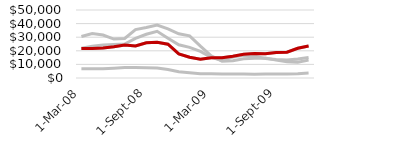
| Category | Chewbacca | Hansolo | James Kirk | Luke Skywalker | Chart Series |
|---|---|---|---|---|---|
| 2008-03-01 | 6800.212 | 21645.733 | 21915.526 | 30565.916 | 21645.733 |
| 2008-04-01 | 6769.22 | 21751.544 | 23276.043 | 32691.851 | 21751.544 |
| 2008-05-01 | 6837.89 | 22045.744 | 24221.882 | 31596.879 | 22045.744 |
| 2008-06-01 | 7235.322 | 22991.915 | 24615.492 | 28625.605 | 22991.915 |
| 2008-07-01 | 7671.87 | 24306.774 | 24910.431 | 29048.404 | 24306.774 |
| 2008-08-01 | 7752.169 | 23598.937 | 29152.21 | 35579.129 | 23598.937 |
| 2008-09-01 | 7557.637 | 25943.949 | 32132.61 | 37086.637 | 25943.949 |
| 2008-10-01 | 7401.609 | 26291.553 | 34356.215 | 38893.36 | 26291.553 |
| 2008-11-01 | 6240.589 | 24834.553 | 29274.208 | 36179.556 | 24834.553 |
| 2008-12-01 | 4608.259 | 17763.187 | 24423.996 | 32497.363 | 17763.187 |
| 2009-01-01 | 3829.339 | 15307.944 | 22487.397 | 30959.569 | 15307.944 |
| 2009-02-01 | 3177.815 | 13800.843 | 19550.976 | 23433.602 | 13800.843 |
| 2009-03-01 | 3103.055 | 14933.558 | 15097.594 | 16343.542 | 14933.558 |
| 2009-04-01 | 2971.056 | 14822.607 | 12908.416 | 12390.436 | 14822.607 |
| 2009-05-01 | 2969.522 | 15967.554 | 15475.724 | 12763.522 | 15967.554 |
| 2009-06-01 | 2888.689 | 17445.098 | 16785.265 | 14103.437 | 17445.098 |
| 2009-07-01 | 2847.187 | 17958.992 | 16095.934 | 14513.25 | 17958.992 |
| 2009-08-01 | 2998.377 | 17782.456 | 14255.791 | 14653.255 | 17782.456 |
| 2009-09-01 | 2972.09 | 18801.969 | 13609.506 | 13150.25 | 18801.969 |
| 2009-10-01 | 2886.564 | 19016.258 | 13199.323 | 11921.261 | 19016.258 |
| 2009-11-01 | 3152.997 | 21845.918 | 13901.681 | 11674.989 | 21845.918 |
| 2009-12-01 | 3602.524 | 23586.826 | 15012.34 | 13152.394 | 23586.826 |